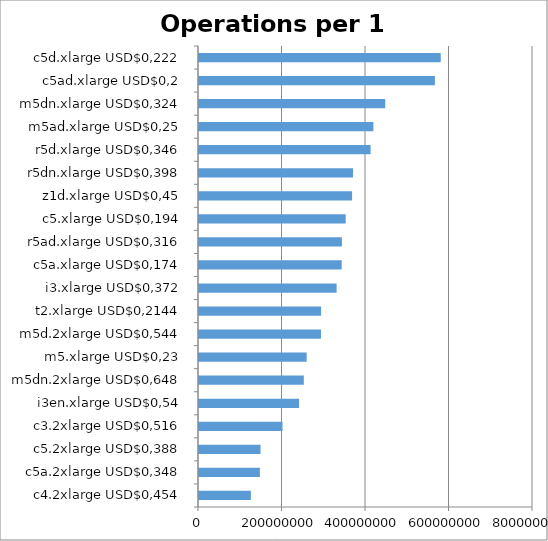
| Category | Operations per 1 USD |
|---|---|
| c4.2xlarge USD$0,454 | 124237723.743 |
| c5a.2xlarge USD$0,348 | 145876338.661 |
| c5.2xlarge USD$0,388 | 147385017.924 |
| c3.2xlarge USD$0,516 | 199955630.816 |
| i3en.xlarge USD$0,54 | 239655528.149 |
| m5dn.2xlarge USD$0,648 | 251099446.029 |
| m5.xlarge USD$0,23 | 257908837.585 |
| m5d.2xlarge USD$0,544 | 292171335.236 |
| t2.xlarge USD$0,2144 | 292437140.576 |
| i3.xlarge USD$0,372 | 329621226.147 |
| c5a.xlarge USD$0,174 | 341738397.217 |
| r5ad.xlarge USD$0,316 | 342285677.472 |
| c5.xlarge USD$0,194 | 351382952.829 |
| z1d.xlarge USD$0,45 | 366671296.238 |
| r5dn.xlarge USD$0,398 | 368968414.796 |
| r5d.xlarge USD$0,346 | 411036840.728 |
| m5ad.xlarge USD$0,25 | 417705155.795 |
| m5dn.xlarge USD$0,324 | 446037216.099 |
| c5ad.xlarge USD$0,2 | 565024995.233 |
| c5d.xlarge USD$0,222 | 579062086.699 |